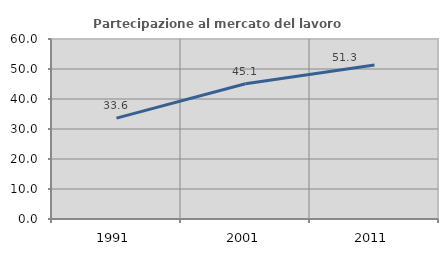
| Category | Partecipazione al mercato del lavoro  femminile |
|---|---|
| 1991.0 | 33.635 |
| 2001.0 | 45.07 |
| 2011.0 | 51.336 |